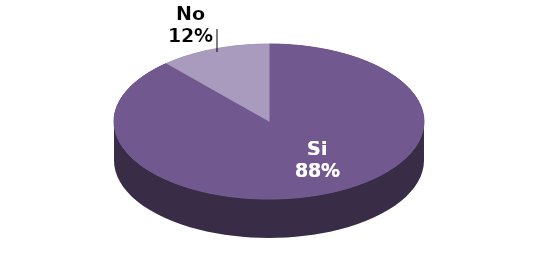
| Category | Series 1 |
|---|---|
| Si | 23 |
| No | 3 |